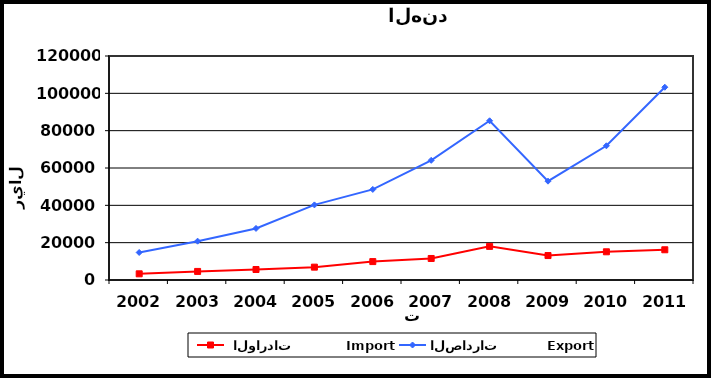
| Category |  الواردات           Import | الصادرات          Export |
|---|---|---|
| 2002.0 | 3307 | 14742 |
| 2003.0 | 4589 | 20804 |
| 2004.0 | 5622 | 27625 |
| 2005.0 | 6884 | 40237 |
| 2006.0 | 9864 | 48520 |
| 2007.0 | 11529 | 64120 |
| 2008.0 | 18012 | 85295 |
| 2009.0 | 13095 | 52951 |
| 2010.0 | 15116 | 71891 |
| 2011.0 | 16191 | 103272 |